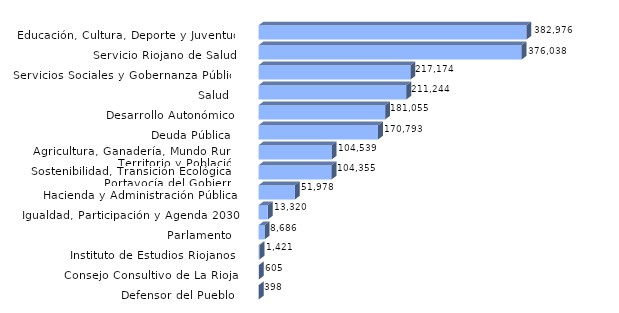
| Category | Series 0 |
|---|---|
| Defensor del Pueblo | 398 |
| Consejo Consultivo de La Rioja | 605.47 |
| Instituto de Estudios Riojanos | 1421.13 |
| Parlamento | 8686 |
| Igualdad, Participación y Agenda 2030 | 13320.27 |
| Hacienda y Administración Pública | 51978.07 |
| Sostenibilidad, Transición Ecológica y Portavocía del Gobierno | 104355.29 |
| Agricultura, Ganadería, Mundo Rural, Territorio y Población | 104539.11 |
| Deuda Pública | 170793.28 |
| Desarrollo Autonómico | 181055.44 |
| Salud | 211243.97 |
| Servicios Sociales y Gobernanza Pública | 217174.3 |
| Servicio Riojano de Salud | 376037.58 |
| Educación, Cultura, Deporte y Juventud | 382976.07 |